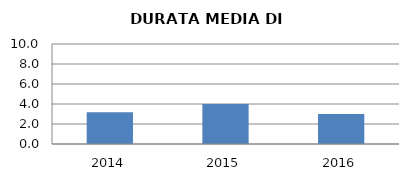
| Category | 2014 2015 2016 |
|---|---|
| 2014.0 | 3.167 |
| 2015.0 | 4 |
| 2016.0 | 3 |